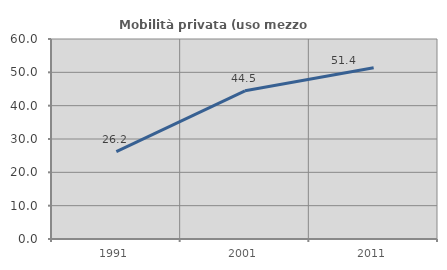
| Category | Mobilità privata (uso mezzo privato) |
|---|---|
| 1991.0 | 26.232 |
| 2001.0 | 44.466 |
| 2011.0 | 51.383 |